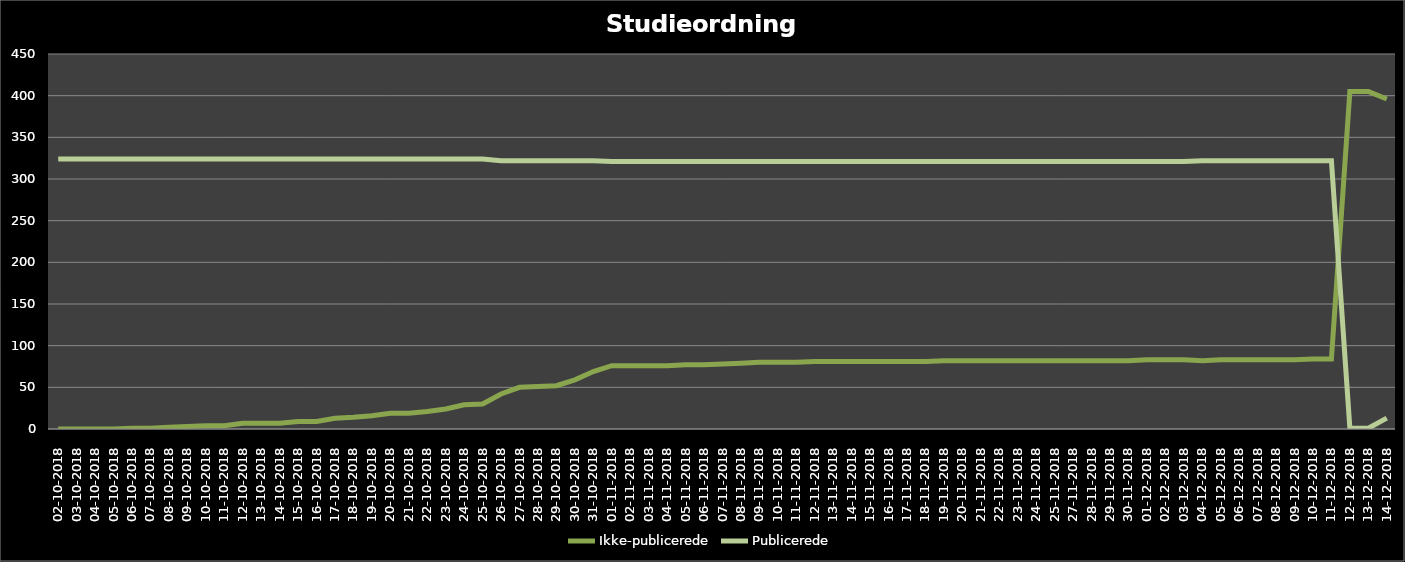
| Category | Ikke-publicerede | Publicerede |
|---|---|---|
| 02-10-2018 | 0 | 324 |
| 03-10-2018 | 0 | 324 |
| 04-10-2018 | 0 | 324 |
| 05-10-2018 | 0 | 324 |
| 06-10-2018 | 1 | 324 |
| 07-10-2018 | 1 | 324 |
| 08-10-2018 | 2 | 324 |
| 09-10-2018 | 3 | 324 |
| 10-10-2018 | 4 | 324 |
| 11-10-2018 | 4 | 324 |
| 12-10-2018 | 7 | 324 |
| 13-10-2018 | 7 | 324 |
| 14-10-2018 | 7 | 324 |
| 15-10-2018 | 9 | 324 |
| 16-10-2018 | 9 | 324 |
| 17-10-2018 | 13 | 324 |
| 18-10-2018 | 14 | 324 |
| 19-10-2018 | 16 | 324 |
| 20-10-2018 | 19 | 324 |
| 21-10-2018 | 19 | 324 |
| 22-10-2018 | 21 | 324 |
| 23-10-2018 | 24 | 324 |
| 24-10-2018 | 29 | 324 |
| 25-10-2018 | 30 | 324 |
| 26-10-2018 | 42 | 322 |
| 27-10-2018 | 50 | 322 |
| 28-10-2018 | 51 | 322 |
| 29-10-2018 | 52 | 322 |
| 30-10-2018 | 59 | 322 |
| 31-10-2018 | 69 | 322 |
| 01-11-2018 | 76 | 321 |
| 02-11-2018 | 76 | 321 |
| 03-11-2018 | 76 | 321 |
| 04-11-2018 | 76 | 321 |
| 05-11-2018 | 77 | 321 |
| 06-11-2018 | 77 | 321 |
| 07-11-2018 | 78 | 321 |
| 08-11-2018 | 79 | 321 |
| 09-11-2018 | 80 | 321 |
| 10-11-2018 | 80 | 321 |
| 11-11-2018 | 80 | 321 |
| 12-11-2018 | 81 | 321 |
| 13-11-2018 | 81 | 321 |
| 14-11-2018 | 81 | 321 |
| 15-11-2018 | 81 | 321 |
| 16-11-2018 | 81 | 321 |
| 17-11-2018 | 81 | 321 |
| 18-11-2018 | 81 | 321 |
| 19-11-2018 | 82 | 321 |
| 20-11-2018 | 82 | 321 |
| 21-11-2018 | 82 | 321 |
| 22-11-2018 | 82 | 321 |
| 23-11-2018 | 82 | 321 |
| 24-11-2018 | 82 | 321 |
| 25-11-2018 | 82 | 321 |
| 27-11-2018 | 82 | 321 |
| 28-11-2018 | 82 | 321 |
| 29-11-2018 | 82 | 321 |
| 30-11-2018 | 82 | 321 |
| 01-12-2018 | 83 | 321 |
| 02-12-2018 | 83 | 321 |
| 03-12-2018 | 83 | 321 |
| 04-12-2018 | 82 | 322 |
| 05-12-2018 | 83 | 322 |
| 06-12-2018 | 83 | 322 |
| 07-12-2018 | 83 | 322 |
| 08-12-2018 | 83 | 322 |
| 09-12-2018 | 83 | 322 |
| 10-12-2018 | 84 | 322 |
| 11-12-2018 | 84 | 322 |
| 12-12-2018 | 405 | 1 |
| 13-12-2018 | 405 | 1 |
| 14-12-2018 | 396 | 13 |